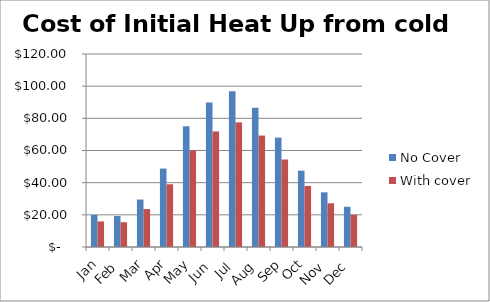
| Category | No Cover | With cover |
|---|---|---|
| Jan | 19.887 | 15.91 |
| Feb | 19.246 | 15.396 |
| Mar | 29.51 | 23.608 |
| Apr | 48.756 | 39.004 |
| May | 75.058 | 60.046 |
| Jun | 89.813 | 71.85 |
| Jul | 96.87 | 77.496 |
| Aug | 86.605 | 69.284 |
| Sep | 68.001 | 54.401 |
| Oct | 47.472 | 37.978 |
| Nov | 34.001 | 27.2 |
| Dec | 25.019 | 20.015 |